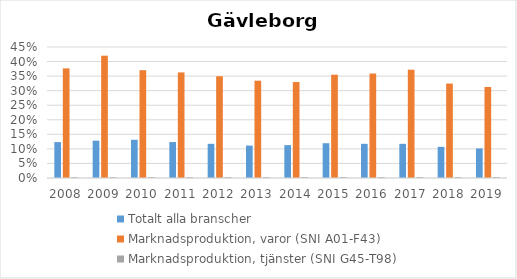
| Category | Totalt alla branscher | Marknadsproduktion, varor (SNI A01-F43) | Marknadsproduktion, tjänster (SNI G45-T98) |
|---|---|---|---|
| 2008 | 0.123 | 0.377 | 0.003 |
| 2009 | 0.128 | 0.42 | 0.003 |
| 2010 | 0.131 | 0.37 | 0.003 |
| 2011 | 0.123 | 0.363 | 0.003 |
| 2012 | 0.117 | 0.349 | 0.003 |
| 2013 | 0.111 | 0.334 | 0.003 |
| 2014 | 0.113 | 0.33 | 0.003 |
| 2015 | 0.119 | 0.355 | 0.003 |
| 2016 | 0.117 | 0.359 | 0.003 |
| 2017 | 0.117 | 0.372 | 0.003 |
| 2018 | 0.107 | 0.324 | 0.003 |
| 2019 | 0.102 | 0.313 | 0.003 |